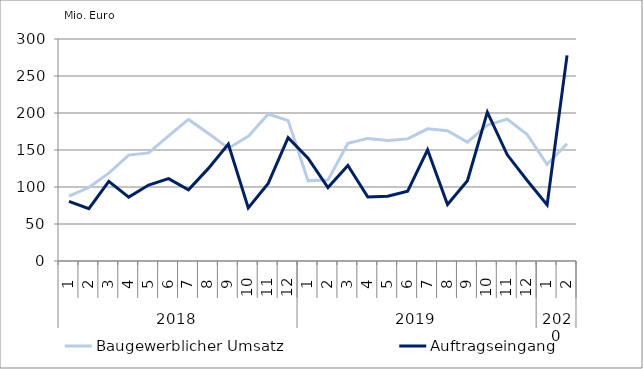
| Category | Baugewerblicher Umsatz | Auftragseingang |
|---|---|---|
| 0 | 87640.529 | 80684.627 |
| 1 | 99259.455 | 70746.763 |
| 2 | 118764.324 | 107538.747 |
| 3 | 143144.178 | 86374.619 |
| 4 | 146070.782 | 102661.329 |
| 5 | 169150.753 | 111287.709 |
| 6 | 191277.885 | 96286.662 |
| 7 | 172425.535 | 125142.495 |
| 8 | 152354.98 | 158112.302 |
| 9 | 168372.756 | 71808.619 |
| 10 | 198558.472 | 104904.147 |
| 11 | 189665.914 | 166653.461 |
| 12 | 108616.605 | 139065.287 |
| 13 | 109331.58 | 99318.609 |
| 14 | 159117.81 | 129002.041 |
| 15 | 165654.287 | 86579.2 |
| 16 | 162976.056 | 87644.362 |
| 17 | 165026.188 | 94463.186 |
| 18 | 178622.938 | 150345.08 |
| 19 | 176074.101 | 76434.317 |
| 20 | 160663.041 | 108444.162 |
| 21 | 183589.485 | 201122.697 |
| 22 | 191777.213 | 143514.792 |
| 23 | 170885.223 | 108780.022 |
| 24 | 130445.562 | 75891.481 |
| 25 | 158433.655 | 277923.85 |